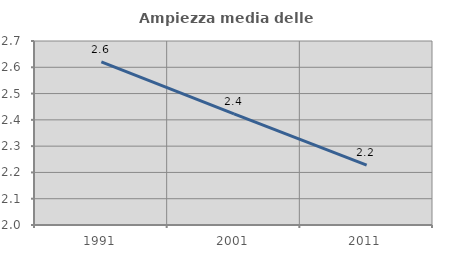
| Category | Ampiezza media delle famiglie |
|---|---|
| 1991.0 | 2.62 |
| 2001.0 | 2.423 |
| 2011.0 | 2.227 |